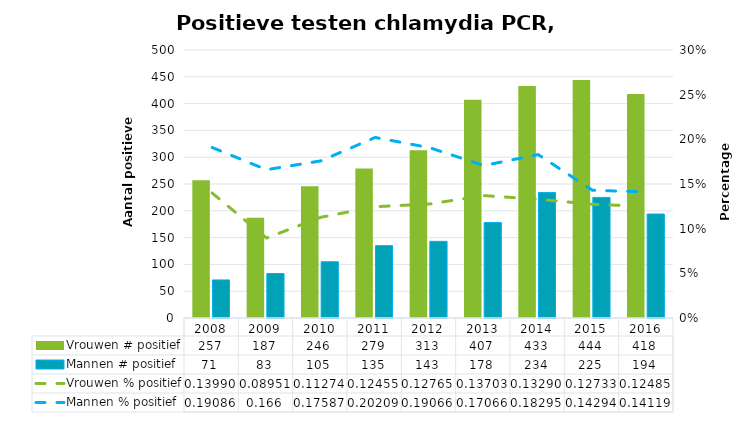
| Category | Vrouwen # positief | Mannen # positief |
|---|---|---|
| 2008.0 | 257 | 71 |
| 2009.0 | 187 | 83 |
| 2010.0 | 246 | 105 |
| 2011.0 | 279 | 135 |
| 2012.0 | 313 | 143 |
| 2013.0 | 407 | 178 |
| 2014.0 | 433 | 234 |
| 2015.0 | 444 | 225 |
| 2016.0 | 418 | 194 |